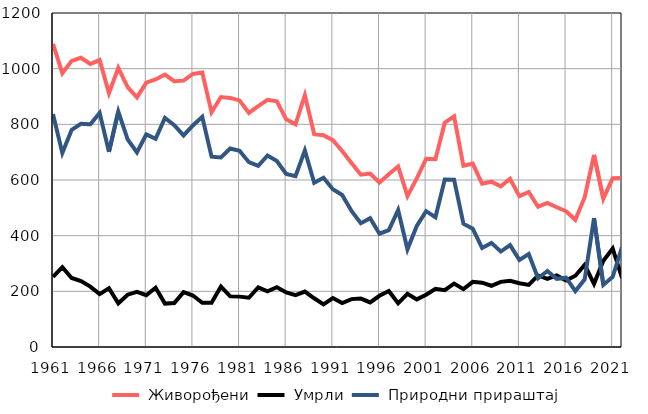
| Category |  Живорођени |  Умрли |  Природни прираштај |
|---|---|---|---|
| 1961.0 | 1089 | 252 | 837 |
| 1962.0 | 984 | 287 | 697 |
| 1963.0 | 1028 | 248 | 780 |
| 1964.0 | 1039 | 237 | 802 |
| 1965.0 | 1017 | 217 | 800 |
| 1966.0 | 1031 | 190 | 841 |
| 1967.0 | 912 | 211 | 701 |
| 1968.0 | 1003 | 157 | 846 |
| 1969.0 | 934 | 188 | 746 |
| 1970.0 | 897 | 198 | 699 |
| 1971.0 | 950 | 186 | 764 |
| 1972.0 | 961 | 213 | 748 |
| 1973.0 | 979 | 156 | 823 |
| 1974.0 | 955 | 158 | 797 |
| 1975.0 | 957 | 197 | 760 |
| 1976.0 | 981 | 185 | 796 |
| 1977.0 | 986 | 159 | 827 |
| 1978.0 | 843 | 159 | 684 |
| 1979.0 | 898 | 217 | 681 |
| 1980.0 | 895 | 182 | 713 |
| 1981.0 | 886 | 181 | 705 |
| 1982.0 | 841 | 177 | 664 |
| 1983.0 | 865 | 214 | 651 |
| 1984.0 | 888 | 200 | 688 |
| 1985.0 | 883 | 215 | 668 |
| 1986.0 | 818 | 196 | 622 |
| 1987.0 | 800 | 186 | 614 |
| 1988.0 | 905 | 199 | 706 |
| 1989.0 | 765 | 175 | 590 |
| 1990.0 | 761 | 153 | 608 |
| 1991.0 | 743 | 176 | 567 |
| 1992.0 | 704 | 158 | 546 |
| 1993.0 | 661 | 172 | 489 |
| 1994.0 | 619 | 174 | 445 |
| 1995.0 | 623 | 160 | 463 |
| 1996.0 | 591 | 184 | 407 |
| 1997.0 | 621 | 201 | 420 |
| 1998.0 | 649 | 157 | 492 |
| 1999.0 | 542 | 191 | 351 |
| 2000.0 | 606 | 171 | 435 |
| 2001.0 | 676 | 188 | 488 |
| 2002.0 | 675 | 209 | 466 |
| 2003.0 | 806 | 204 | 602 |
| 2004.0 | 829 | 228 | 601 |
| 2005.0 | 651 | 208 | 443 |
| 2006.0 | 659 | 234 | 425 |
| 2007.0 | 587 | 231 | 356 |
| 2008.0 | 594 | 220 | 374 |
| 2009.0 | 577 | 234 | 343 |
| 2010.0 | 604 | 238 | 366 |
| 2011.0 | 542 | 229 | 313 |
| 2012.0 | 557 | 223 | 334 |
| 2013.0 | 504 | 257 | 247 |
| 2014.0 | 518 | 245 | 273 |
| 2015.0 | 502 | 257 | 245 |
| 2016.0 | 488 | 239 | 249 |
| 2017.0 | 457 | 256 | 201 |
| 2018.0 | 538 | 295 | 243 |
| 2019.0 | 690 | 227 | 463 |
| 2020.0 | 533 | 310 | 223 |
| 2021.0 | 606 | 354 | 252 |
| 2022.0 | 607 | 248 | 359 |